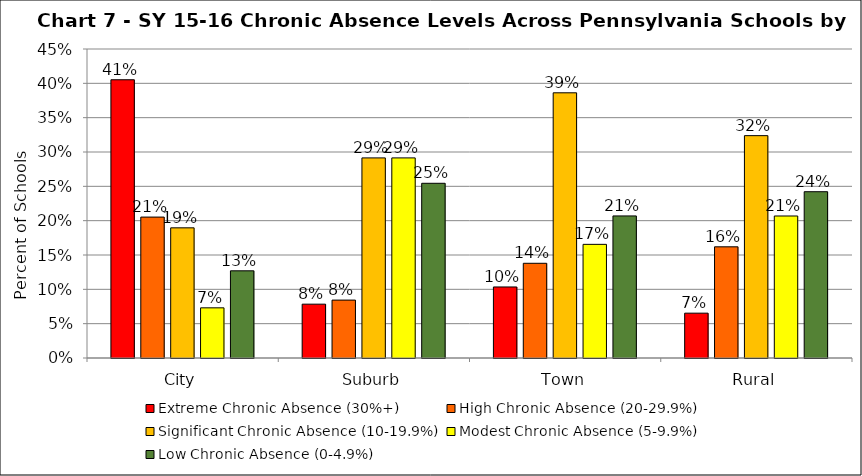
| Category | Extreme Chronic Absence (30%+) | High Chronic Absence (20-29.9%) | Significant Chronic Absence (10-19.9%) | Modest Chronic Absence (5-9.9%) | Low Chronic Absence (0-4.9%) |
|---|---|---|---|---|---|
| 0 | 0.405 | 0.205 | 0.19 | 0.073 | 0.127 |
| 1 | 0.078 | 0.084 | 0.291 | 0.291 | 0.254 |
| 2 | 0.103 | 0.138 | 0.386 | 0.166 | 0.207 |
| 3 | 0.065 | 0.162 | 0.324 | 0.207 | 0.242 |